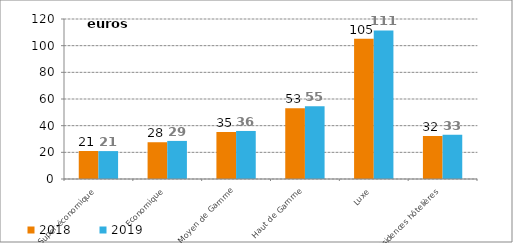
| Category | 2018 | 2019 |
|---|---|---|
| Super-économique | 20.982 | 20.929 |
| Economique | 27.568 | 28.567 |
| Moyen de Gamme | 35.294 | 36.029 |
| Haut de Gamme | 52.998 | 54.618 |
| Luxe | 105.252 | 111.414 |
| Résidences hôtelières | 32.205 | 33.215 |